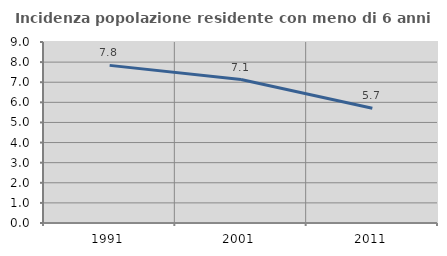
| Category | Incidenza popolazione residente con meno di 6 anni |
|---|---|
| 1991.0 | 7.838 |
| 2001.0 | 7.135 |
| 2011.0 | 5.704 |